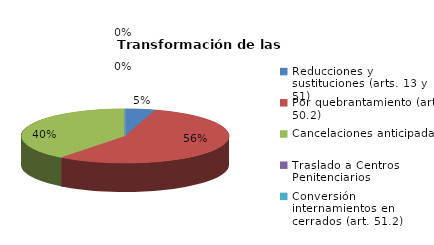
| Category | Series 0 |
|---|---|
| Reducciones y sustituciones (arts. 13 y 51) | 2 |
| Por quebrantamiento (art. 50.2) | 24 |
| Cancelaciones anticipadas | 17 |
| Traslado a Centros Penitenciarios | 0 |
| Conversión internamientos en cerrados (art. 51.2) | 0 |